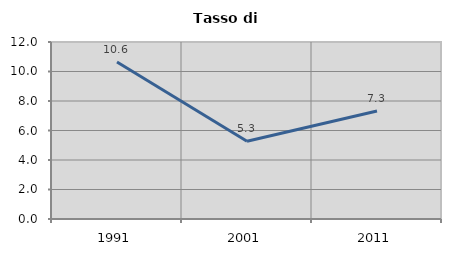
| Category | Tasso di disoccupazione   |
|---|---|
| 1991.0 | 10.648 |
| 2001.0 | 5.274 |
| 2011.0 | 7.325 |